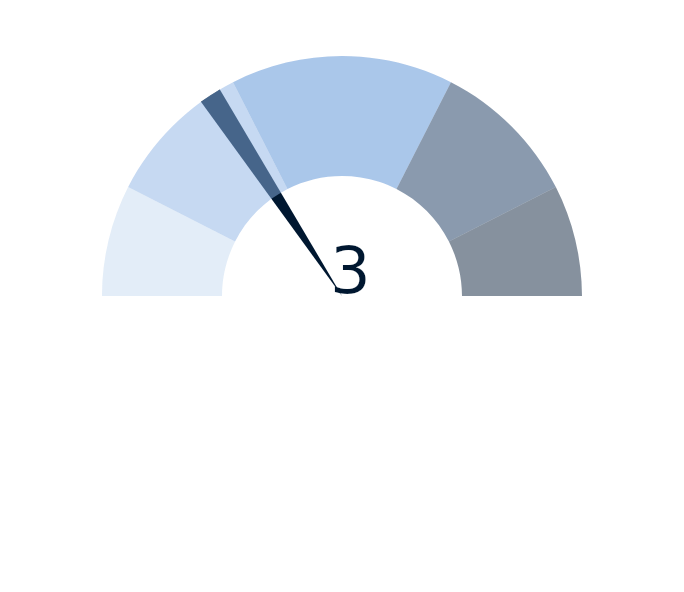
| Category | factor |
|---|---|
| 0 | 3 |
| 1 | 0.3 |
| 2 | 16.7 |